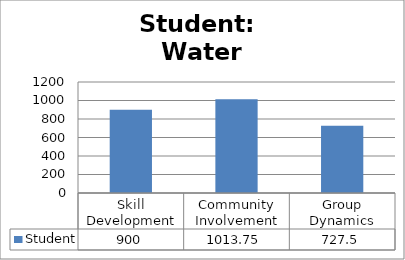
| Category | Student |
|---|---|
| Skill Development | 900 |
| Community Involvement | 1013.75 |
| Group Dynamics | 727.5 |